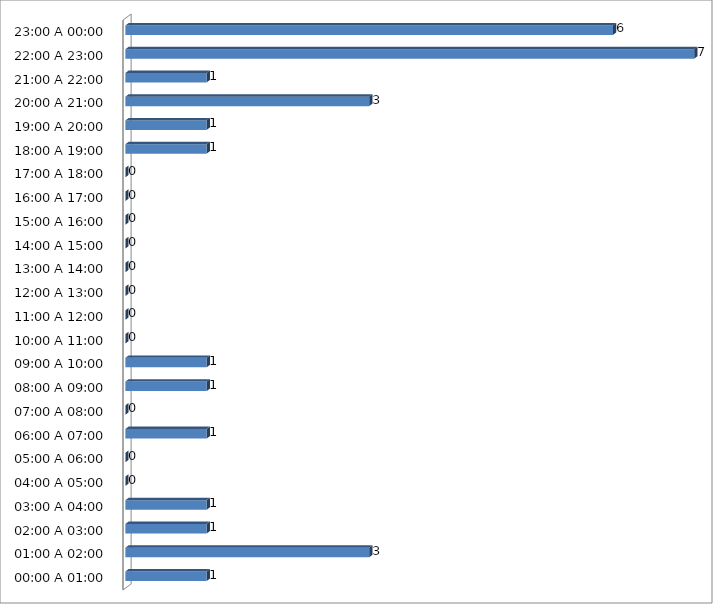
| Category | Series 0 |
|---|---|
| 00:00 A 01:00 | 1 |
| 01:00 A 02:00 | 3 |
| 02:00 A 03:00 | 1 |
| 03:00 A 04:00 | 1 |
| 04:00 A 05:00 | 0 |
| 05:00 A 06:00 | 0 |
| 06:00 A 07:00 | 1 |
| 07:00 A 08:00 | 0 |
| 08:00 A 09:00 | 1 |
| 09:00 A 10:00 | 1 |
| 10:00 A 11:00 | 0 |
| 11:00 A 12:00 | 0 |
| 12:00 A 13:00 | 0 |
| 13:00 A 14:00 | 0 |
| 14:00 A 15:00 | 0 |
| 15:00 A 16:00 | 0 |
| 16:00 A 17:00 | 0 |
| 17:00 A 18:00 | 0 |
| 18:00 A 19:00 | 1 |
| 19:00 A 20:00 | 1 |
| 20:00 A 21:00 | 3 |
| 21:00 A 22:00 | 1 |
| 22:00 A 23:00 | 7 |
| 23:00 A 00:00 | 6 |